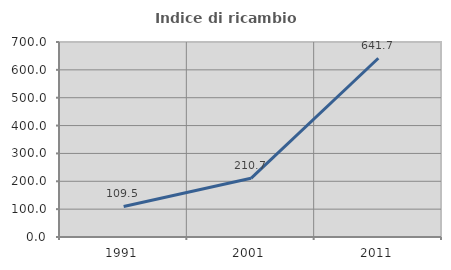
| Category | Indice di ricambio occupazionale  |
|---|---|
| 1991.0 | 109.524 |
| 2001.0 | 210.714 |
| 2011.0 | 641.667 |